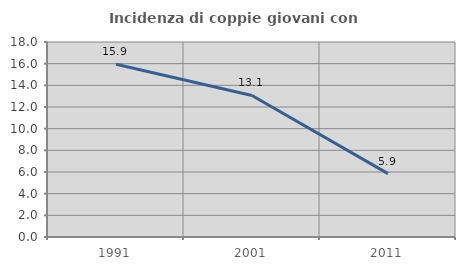
| Category | Incidenza di coppie giovani con figli |
|---|---|
| 1991.0 | 15.942 |
| 2001.0 | 13.068 |
| 2011.0 | 5.851 |